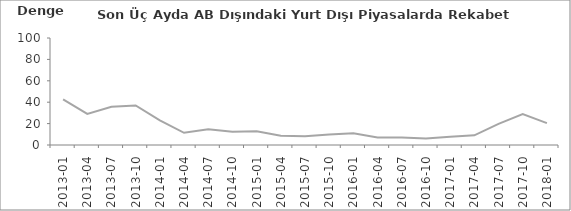
| Category | Son Üç Aydaki AB Dışındaki Piyasalarda Rekabet Gücü |
|---|---|
| 2013-01 | 42.7 |
| 2013-04 | 29.1 |
| 2013-07 | 35.8 |
| 2013-10 | 36.9 |
| 2014-01 | 23 |
| 2014-04 | 11.4 |
| 2014-07 | 14.6 |
| 2014-10 | 12.4 |
| 2015-01 | 12.9 |
| 2015-04 | 8.6 |
| 2015-07 | 8.1 |
| 2015-10 | 9.9 |
| 2016-01 | 11 |
| 2016-04 | 7 |
| 2016-07 | 6.9 |
| 2016-10 | 6 |
| 2017-01 | 7.8 |
| 2017-04 | 9 |
| 2017-07 | 19.8 |
| 2017-10 | 28.8 |
| 2018-01 | 20.4 |